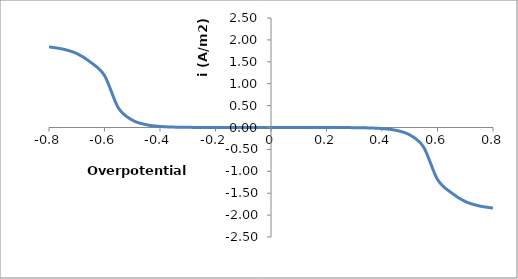
| Category | Series 0 |
|---|---|
| -0.8 | 1.84 |
| -0.75 | 1.79 |
| -0.7 | 1.69 |
| -0.65 | 1.49 |
| -0.6 | 1.185 |
| -0.55 | 0.448 |
| -0.5 | 0.169 |
| -0.45 | 0.064 |
| -0.4 | 0.024 |
| -0.35 | 0.009 |
| -0.3 | 0.003 |
| -0.25 | 0.001 |
| -0.200000000000001 | 0 |
| -0.150000000000001 | 0 |
| -0.100000000000001 | 0 |
| -0.0500000000000009 | 0 |
| -0.01 | 0 |
| 0.01 | 0 |
| 0.049999999999999 | 0 |
| 0.099999999999999 | 0 |
| 0.149999999999999 | 0 |
| 0.199999999999999 | 0 |
| 0.249999999999999 | -0.001 |
| 0.299999999999999 | -0.003 |
| 0.349999999999999 | -0.009 |
| 0.399999999999999 | -0.024 |
| 0.45 | -0.064 |
| 0.5 | -0.169 |
| 0.55 | -0.448 |
| 0.6 | -1.185 |
| 0.65 | -1.49 |
| 0.7 | -1.69 |
| 0.75 | -1.79 |
| 0.8 | -1.84 |